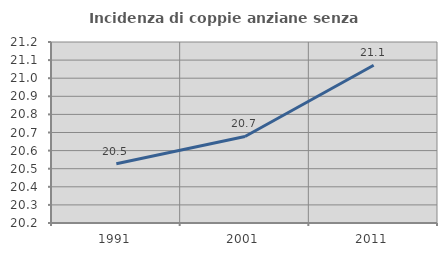
| Category | Incidenza di coppie anziane senza figli  |
|---|---|
| 1991.0 | 20.528 |
| 2001.0 | 20.678 |
| 2011.0 | 21.071 |